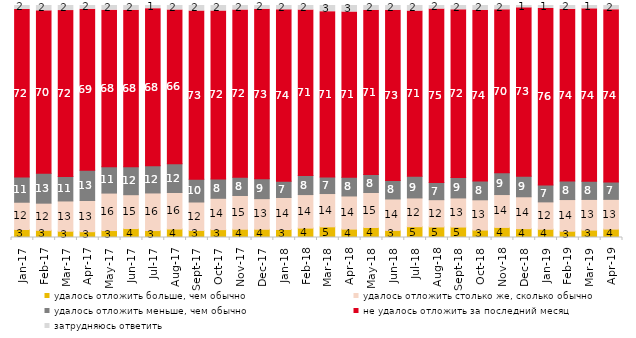
| Category | удалось отложить больше, чем обычно | удалось отложить столько же, сколько обычно | удалось отложить меньше, чем обычно | не удалось отложить за последний месяц | затрудняюсь ответить |
|---|---|---|---|---|---|
| 2017-01-01 | 3.45 | 11.75 | 10.9 | 72.2 | 1.7 |
| 2017-02-01 | 3.1 | 11.7 | 12.85 | 70.05 | 2.3 |
| 2017-03-01 | 2.7 | 13.05 | 10.55 | 71.5 | 2.2 |
| 2017-04-01 | 2.5 | 13.45 | 13 | 69.4 | 1.6 |
| 2017-05-01 | 3 | 16.15 | 11.35 | 67.5 | 2 |
| 2017-06-01 | 3.85 | 14.6 | 12 | 67.5 | 2.05 |
| 2017-07-01 | 3 | 16.2 | 11.75 | 67.7 | 1.35 |
| 2017-08-01 | 3.65 | 15.75 | 12.4 | 66.3 | 1.9 |
| 2017-09-01 | 3.05 | 12.25 | 9.8 | 72.55 | 2.35 |
| 2017-10-01 | 3.4 | 13.5 | 8.3 | 72.45 | 2.35 |
| 2017-11-01 | 3.55 | 14.55 | 7.85 | 72.05 | 1.95 |
| 2017-12-01 | 3.55 | 13.2 | 8.55 | 73.1 | 1.6 |
| 2018-01-01 | 3.45 | 13.8 | 7 | 73.9 | 1.85 |
| 2018-02-01 | 4.05 | 14.45 | 8.25 | 71.3 | 1.95 |
| 2018-03-01 | 4.6 | 14.35 | 7.1 | 71.3 | 2.65 |
| 2018-04-01 | 3.6 | 14.3 | 8.05 | 71.25 | 2.8 |
| 2018-05-01 | 4.3 | 15.1 | 7.75 | 70.75 | 2.1 |
| 2018-06-01 | 3.05 | 13.55 | 7.95 | 73.4 | 2.05 |
| 2018-07-01 | 4.65 | 12.4 | 9.35 | 71.2 | 2.4 |
| 2018-08-01 | 4.55 | 11.75 | 7.45 | 74.7 | 1.55 |
| 2018-09-01 | 4.5 | 12.55 | 8.8 | 72.3 | 1.85 |
| 2018-10-01 | 3.2 | 13.05 | 8.05 | 73.6 | 2.1 |
| 2018-11-01 | 4.341 | 14.172 | 9.381 | 70.259 | 1.846 |
| 2018-12-01 | 3.8 | 13.75 | 8.9 | 72.55 | 1 |
| 2019-01-01 | 3.55 | 11.8 | 7.25 | 76.1 | 1.3 |
| 2019-02-01 | 2.7 | 13.65 | 7.95 | 74.05 | 1.65 |
| 2019-03-01 | 3.182 | 13.227 | 7.857 | 74.291 | 1.442 |
| 2019-04-01 | 3.614 | 12.822 | 7.475 | 74.257 | 1.832 |